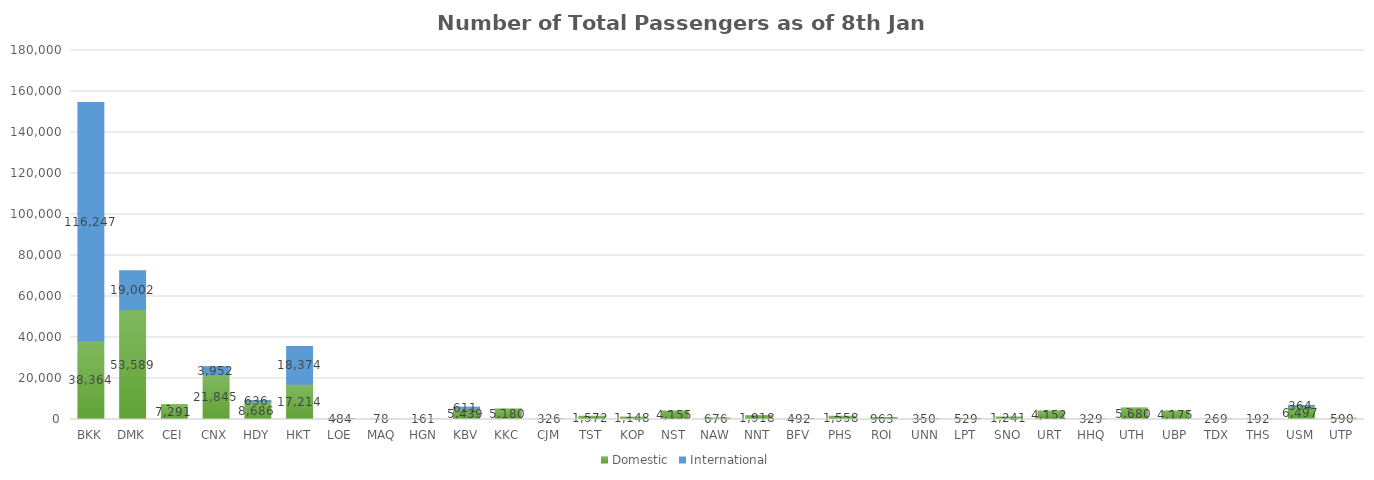
| Category | Domestic | International |
|---|---|---|
| BKK | 38364 | 116247 |
| DMK | 53589 | 19002 |
| CEI | 7291 | 0 |
| CNX | 21845 | 3952 |
| HDY | 8686 | 636 |
| HKT | 17214 | 18374 |
| LOE | 484 | 0 |
| MAQ | 78 | 0 |
| HGN | 161 | 0 |
| KBV | 5439 | 611 |
| KKC | 5180 | 0 |
| CJM | 326 | 0 |
| TST | 1572 | 0 |
| KOP | 1148 | 0 |
| NST | 4155 | 0 |
| NAW | 676 | 0 |
| NNT | 1918 | 0 |
| BFV | 492 | 0 |
| PHS | 1558 | 0 |
| ROI | 963 | 0 |
| UNN | 350 | 0 |
| LPT | 529 | 0 |
| SNO | 1241 | 0 |
| URT | 4152 | 0 |
| HHQ | 329 | 0 |
| UTH | 5680 | 0 |
| UBP | 4175 | 0 |
| TDX | 269 | 0 |
| THS | 192 | 0 |
| USM | 6497 | 364 |
| UTP | 590 | 0 |